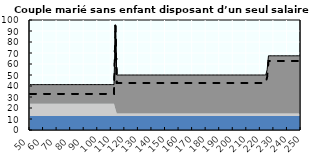
| Category | Coin fiscal marginal (somme des composantes) | Taux d’imposition marginal net |
|---|---|---|
| 50.0 | 41.278 | 32.74 |
| 51.0 | 41.278 | 32.74 |
| 52.0 | 41.278 | 32.74 |
| 53.0 | 41.278 | 32.74 |
| 54.0 | 41.278 | 32.74 |
| 55.0 | 41.278 | 32.74 |
| 56.0 | 41.278 | 32.74 |
| 57.0 | 41.278 | 32.74 |
| 58.0 | 41.278 | 32.74 |
| 59.0 | 41.278 | 32.74 |
| 60.0 | 41.278 | 32.74 |
| 61.0 | 41.278 | 32.74 |
| 62.0 | 41.278 | 32.74 |
| 63.0 | 41.278 | 32.74 |
| 64.0 | 41.278 | 32.74 |
| 65.0 | 41.278 | 32.74 |
| 66.0 | 41.278 | 32.74 |
| 67.0 | 41.278 | 32.74 |
| 68.0 | 41.278 | 32.74 |
| 69.0 | 41.278 | 32.74 |
| 70.0 | 41.278 | 32.74 |
| 71.0 | 41.278 | 32.74 |
| 72.0 | 41.278 | 32.74 |
| 73.0 | 41.278 | 32.74 |
| 74.0 | 41.278 | 32.74 |
| 75.0 | 41.278 | 32.74 |
| 76.0 | 41.278 | 32.74 |
| 77.0 | 41.278 | 32.74 |
| 78.0 | 41.278 | 32.74 |
| 79.0 | 41.278 | 32.74 |
| 80.0 | 41.278 | 32.74 |
| 81.0 | 41.278 | 32.74 |
| 82.0 | 41.278 | 32.74 |
| 83.0 | 41.278 | 32.74 |
| 84.0 | 41.278 | 32.74 |
| 85.0 | 41.278 | 32.74 |
| 86.0 | 41.278 | 32.74 |
| 87.0 | 41.278 | 32.74 |
| 88.0 | 41.278 | 32.74 |
| 89.0 | 41.278 | 32.74 |
| 90.0 | 41.278 | 32.74 |
| 91.0 | 41.278 | 32.74 |
| 92.0 | 41.278 | 32.74 |
| 93.0 | 41.278 | 32.74 |
| 94.0 | 41.278 | 32.74 |
| 95.0 | 41.278 | 32.74 |
| 96.0 | 41.278 | 32.74 |
| 97.0 | 41.278 | 32.74 |
| 98.0 | 41.278 | 32.74 |
| 99.0 | 41.278 | 32.74 |
| 100.0 | 41.278 | 32.74 |
| 101.0 | 41.278 | 32.74 |
| 102.0 | 41.278 | 32.74 |
| 103.0 | 41.278 | 32.74 |
| 104.0 | 41.278 | 32.74 |
| 105.0 | 41.278 | 32.74 |
| 106.0 | 41.278 | 32.74 |
| 107.0 | 41.278 | 32.74 |
| 108.0 | 41.278 | 32.74 |
| 109.0 | 41.278 | 32.74 |
| 110.0 | 41.278 | 32.74 |
| 111.0 | 41.278 | 32.74 |
| 112.0 | 41.278 | 32.74 |
| 113.0 | 95.522 | 94.871 |
| 114.0 | 50.009 | 42.74 |
| 115.0 | 50.009 | 42.74 |
| 116.0 | 50.009 | 42.74 |
| 117.0 | 50.009 | 42.74 |
| 118.0 | 50.009 | 42.74 |
| 119.0 | 50.009 | 42.74 |
| 120.0 | 50.009 | 42.74 |
| 121.0 | 50.009 | 42.74 |
| 122.0 | 50.009 | 42.74 |
| 123.0 | 50.009 | 42.74 |
| 124.0 | 50.009 | 42.74 |
| 125.0 | 50.009 | 42.74 |
| 126.0 | 50.009 | 42.74 |
| 127.0 | 50.009 | 42.74 |
| 128.0 | 50.009 | 42.74 |
| 129.0 | 50.009 | 42.74 |
| 130.0 | 50.009 | 42.74 |
| 131.0 | 50.009 | 42.74 |
| 132.0 | 50.009 | 42.74 |
| 133.0 | 50.009 | 42.74 |
| 134.0 | 50.009 | 42.74 |
| 135.0 | 50.009 | 42.74 |
| 136.0 | 50.009 | 42.74 |
| 137.0 | 50.009 | 42.74 |
| 138.0 | 50.009 | 42.74 |
| 139.0 | 50.009 | 42.74 |
| 140.0 | 50.009 | 42.74 |
| 141.0 | 50.009 | 42.74 |
| 142.0 | 50.009 | 42.74 |
| 143.0 | 50.009 | 42.74 |
| 144.0 | 50.009 | 42.74 |
| 145.0 | 50.009 | 42.74 |
| 146.0 | 50.009 | 42.74 |
| 147.0 | 50.009 | 42.74 |
| 148.0 | 50.009 | 42.74 |
| 149.0 | 50.009 | 42.74 |
| 150.0 | 50.009 | 42.74 |
| 151.0 | 50.009 | 42.74 |
| 152.0 | 50.009 | 42.74 |
| 153.0 | 50.009 | 42.74 |
| 154.0 | 50.009 | 42.74 |
| 155.0 | 50.009 | 42.74 |
| 156.0 | 50.009 | 42.74 |
| 157.0 | 50.009 | 42.74 |
| 158.0 | 50.009 | 42.74 |
| 159.0 | 50.009 | 42.74 |
| 160.0 | 50.009 | 42.74 |
| 161.0 | 50.009 | 42.74 |
| 162.0 | 50.009 | 42.74 |
| 163.0 | 50.009 | 42.74 |
| 164.0 | 50.009 | 42.74 |
| 165.0 | 50.009 | 42.74 |
| 166.0 | 50.009 | 42.74 |
| 167.0 | 50.009 | 42.74 |
| 168.0 | 50.009 | 42.74 |
| 169.0 | 50.009 | 42.74 |
| 170.0 | 50.009 | 42.74 |
| 171.0 | 50.009 | 42.74 |
| 172.0 | 50.009 | 42.74 |
| 173.0 | 50.009 | 42.74 |
| 174.0 | 50.009 | 42.74 |
| 175.0 | 50.009 | 42.74 |
| 176.0 | 50.009 | 42.74 |
| 177.0 | 50.009 | 42.74 |
| 178.0 | 50.009 | 42.74 |
| 179.0 | 50.009 | 42.74 |
| 180.0 | 50.009 | 42.74 |
| 181.0 | 50.009 | 42.74 |
| 182.0 | 50.009 | 42.74 |
| 183.0 | 50.009 | 42.74 |
| 184.0 | 50.009 | 42.74 |
| 185.0 | 50.009 | 42.74 |
| 186.0 | 50.009 | 42.74 |
| 187.0 | 50.009 | 42.74 |
| 188.0 | 50.009 | 42.74 |
| 189.0 | 50.009 | 42.74 |
| 190.0 | 50.009 | 42.74 |
| 191.0 | 50.009 | 42.74 |
| 192.0 | 50.009 | 42.74 |
| 193.0 | 50.009 | 42.74 |
| 194.0 | 50.009 | 42.74 |
| 195.0 | 50.009 | 42.74 |
| 196.0 | 50.009 | 42.74 |
| 197.0 | 50.009 | 42.74 |
| 198.0 | 50.009 | 42.74 |
| 199.0 | 50.009 | 42.74 |
| 200.0 | 50.009 | 42.74 |
| 201.0 | 50.009 | 42.74 |
| 202.0 | 50.009 | 42.74 |
| 203.0 | 50.009 | 42.74 |
| 204.0 | 50.009 | 42.74 |
| 205.0 | 50.009 | 42.74 |
| 206.0 | 50.009 | 42.74 |
| 207.0 | 50.009 | 42.74 |
| 208.0 | 50.009 | 42.74 |
| 209.0 | 50.009 | 42.74 |
| 210.0 | 50.009 | 42.74 |
| 211.0 | 50.009 | 42.74 |
| 212.0 | 50.009 | 42.74 |
| 213.0 | 50.009 | 42.74 |
| 214.0 | 50.009 | 42.74 |
| 215.0 | 50.009 | 42.74 |
| 216.0 | 50.009 | 42.74 |
| 217.0 | 50.009 | 42.74 |
| 218.0 | 50.009 | 42.74 |
| 219.0 | 50.009 | 42.74 |
| 220.0 | 50.009 | 42.74 |
| 221.0 | 50.009 | 42.74 |
| 222.0 | 50.009 | 42.74 |
| 223.0 | 50.009 | 42.74 |
| 224.0 | 50.009 | 42.74 |
| 225.0 | 54.691 | 48.103 |
| 226.0 | 67.47 | 62.74 |
| 227.0 | 67.47 | 62.74 |
| 228.0 | 67.47 | 62.74 |
| 229.0 | 67.47 | 62.74 |
| 230.0 | 67.47 | 62.74 |
| 231.0 | 67.47 | 62.74 |
| 232.0 | 67.47 | 62.74 |
| 233.0 | 67.47 | 62.74 |
| 234.0 | 67.47 | 62.74 |
| 235.0 | 67.47 | 62.74 |
| 236.0 | 67.47 | 62.74 |
| 237.0 | 67.47 | 62.74 |
| 238.0 | 67.47 | 62.74 |
| 239.0 | 67.47 | 62.74 |
| 240.0 | 67.47 | 62.74 |
| 241.0 | 67.47 | 62.74 |
| 242.0 | 67.47 | 62.74 |
| 243.0 | 67.47 | 62.74 |
| 244.0 | 67.47 | 62.74 |
| 245.0 | 67.47 | 62.74 |
| 246.0 | 67.47 | 62.74 |
| 247.0 | 67.47 | 62.74 |
| 248.0 | 67.47 | 62.74 |
| 249.0 | 67.47 | 62.74 |
| 250.0 | 67.47 | 62.74 |